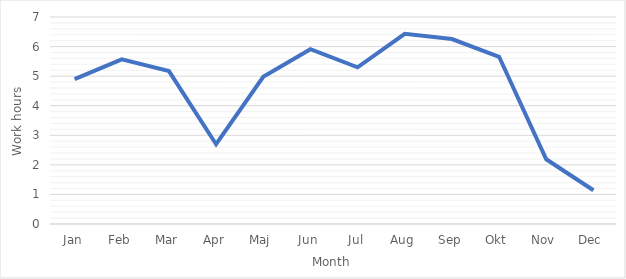
| Category | Series 0 |
|---|---|
| Jan | 4.897 |
| Feb | 5.565 |
| Mar | 5.172 |
| Apr | 2.698 |
| Maj | 4.978 |
| Jun | 5.91 |
| Jul | 5.298 |
| Aug | 6.433 |
| Sep | 6.254 |
| Okt | 5.656 |
| Nov | 2.189 |
| Dec | 1.142 |